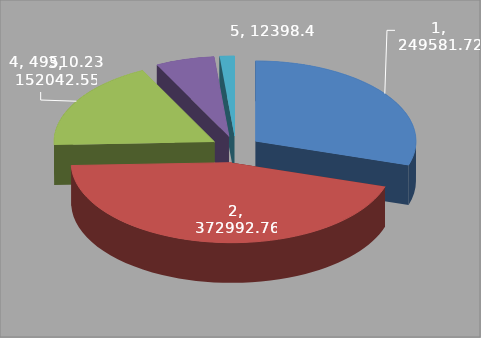
| Category | Series 0 |
|---|---|
| 0 | 249581.72 |
| 1 | 372992.76 |
| 2 | 152042.55 |
| 3 | 49510.23 |
| 4 | 12398.4 |